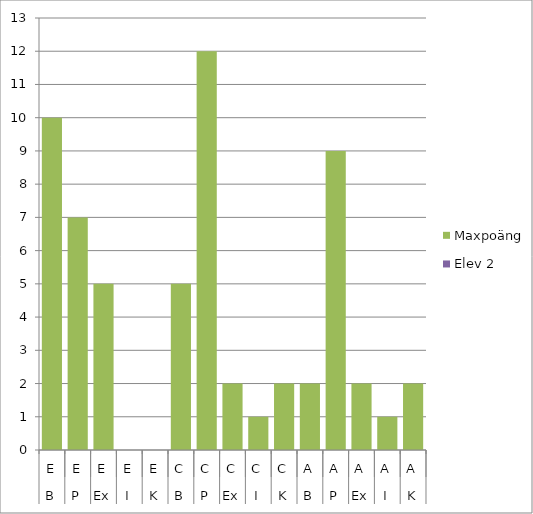
| Category | Maxpoäng | Elev 2 |
|---|---|---|
| 0 | 10 | 0 |
| 1 | 7 | 0 |
| 2 | 5 | 0 |
| 3 | 0 | 0 |
| 4 | 0 | 0 |
| 5 | 5 | 0 |
| 6 | 12 | 0 |
| 7 | 2 | 0 |
| 8 | 1 | 0 |
| 9 | 2 | 0 |
| 10 | 2 | 0 |
| 11 | 9 | 0 |
| 12 | 2 | 0 |
| 13 | 1 | 0 |
| 14 | 2 | 0 |